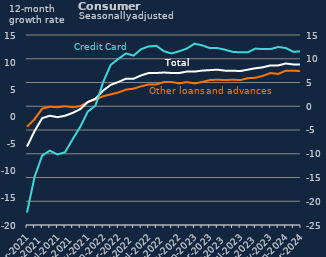
| Category | Other loans and advances | Total |
|---|---|---|
| Mar-2021 | -4.3 | -8.5 |
| Apr-2021 | -2.7 | -5.2 |
| May-2021 | -0.5 | -2.5 |
| Jun-2021 | -0.1 | -2 |
| Jul-2021 | -0.2 | -2.3 |
| Aug-2021 | 0 | -2 |
| Sep-2021 | -0.2 | -1.4 |
| Oct-2021 | 0 | -0.6 |
| Nov-2021 | 0.9 | 0.9 |
| Dec-2021 | 1.4 | 1.6 |
| Jan-2022 | 2.1 | 3.3 |
| Feb-2022 | 2.5 | 4.5 |
| Mar-2022 | 2.9 | 5.1 |
| Apr-2022 | 3.5 | 5.8 |
| May-2022 | 3.7 | 5.8 |
| Jun-2022 | 4.2 | 6.5 |
| Jul-2022 | 4.6 | 7 |
| Aug-2022 | 4.6 | 7 |
| Sep-2022 | 5.1 | 7.1 |
| Oct-2022 | 5.1 | 7 |
| Nov-2022 | 4.8 | 7 |
| Dec-2022 | 5.1 | 7.3 |
| Jan-2023 | 4.8 | 7.3 |
| Feb-2023 | 5.1 | 7.5 |
| Mar-2023 | 5.5 | 7.6 |
| Apr-2023 | 5.6 | 7.7 |
| May-2023 | 5.5 | 7.5 |
| Jun-2023 | 5.6 | 7.5 |
| Jul-2023 | 5.5 | 7.4 |
| Aug-2023 | 5.9 | 7.7 |
| Sep-2023 | 6 | 8 |
| Oct-2023 | 6.4 | 8.2 |
| Nov-2023 | 7 | 8.6 |
| Dec-2023 | 6.8 | 8.6 |
| Jan-2024 | 7.5 | 9 |
| Feb-2024 | 7.5 | 8.8 |
| Mar-2024 | 7.4 | 8.8 |